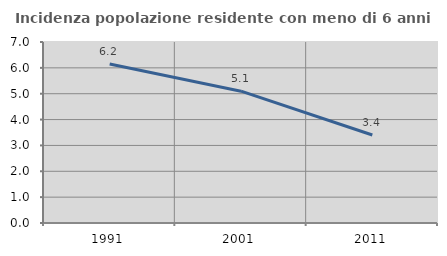
| Category | Incidenza popolazione residente con meno di 6 anni |
|---|---|
| 1991.0 | 6.15 |
| 2001.0 | 5.099 |
| 2011.0 | 3.404 |